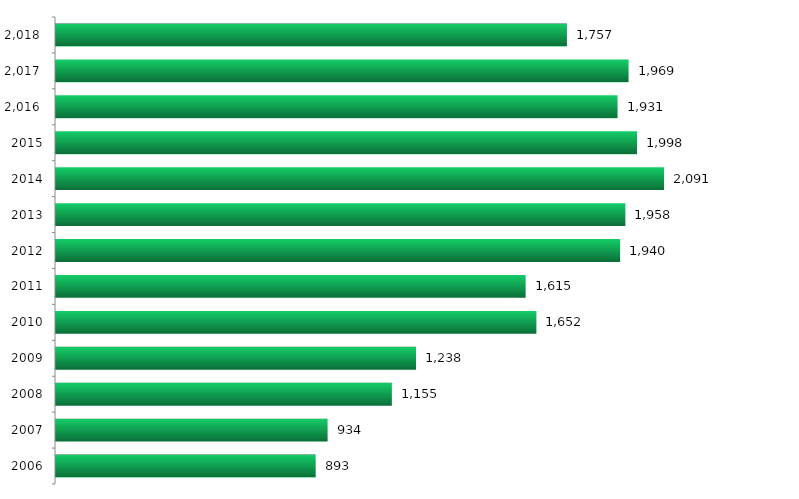
| Category | Ingressantes |
|---|---|
| 2006.0 | 893 |
| 2007.0 | 934 |
| 2008.0 | 1155 |
| 2009.0 | 1238 |
| 2010.0 | 1652 |
| 2011.0 | 1615 |
| 2012.0 | 1940 |
| 2013.0 | 1958 |
| 2014.0 | 2091 |
| 2015.0 | 1998 |
| 2016.0 | 1931 |
| 2017.0 | 1969 |
| 2018.0 | 1757 |